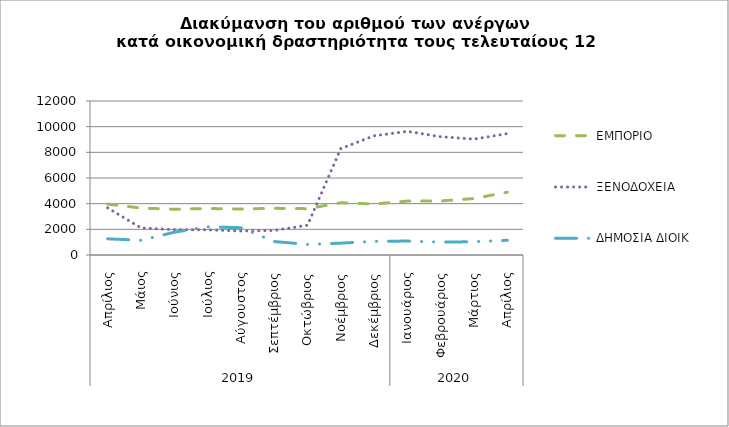
| Category | ΕΜΠΟΡΙΟ | ΞΕΝΟΔΟΧΕΙΑ | ΔΗΜΟΣΙΑ ΔΙΟΙΚ |
|---|---|---|---|
| 0 | 3970 | 3672 | 1261 |
| 1 | 3658 | 2108 | 1144 |
| 2 | 3564 | 1972 | 1777 |
| 3 | 3623 | 1961 | 2202 |
| 4 | 3586 | 1872 | 2125 |
| 5 | 3637 | 1911 | 1050 |
| 6 | 3610 | 2319 | 826 |
| 7 | 4072 | 8292 | 922 |
| 8 | 3969 | 9290 | 1069 |
| 9 | 4202 | 9632 | 1085 |
| 10 | 4212 | 9214 | 1003 |
| 11 | 4400 | 9028 | 1034 |
| 12 | 4898 | 9457 | 1149 |